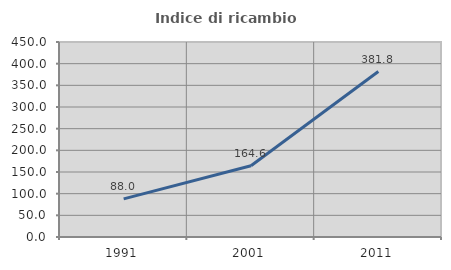
| Category | Indice di ricambio occupazionale  |
|---|---|
| 1991.0 | 88 |
| 2001.0 | 164.583 |
| 2011.0 | 381.818 |